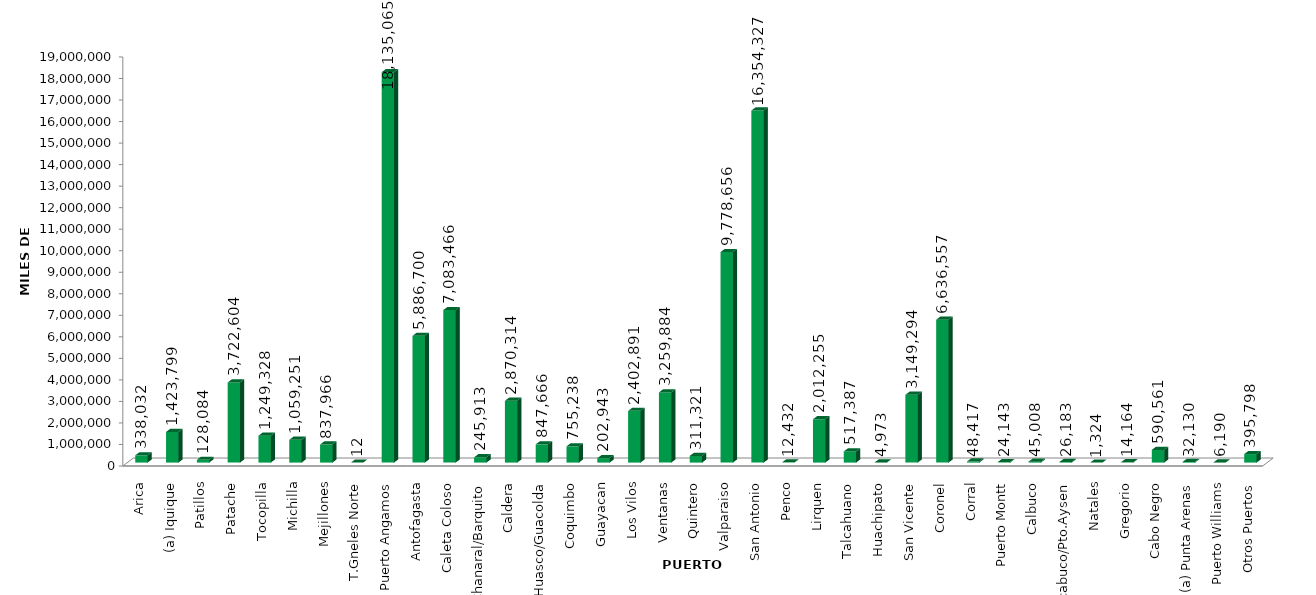
| Category | Series 0 |
|---|---|
| Arica | 338031.973 |
| (a) Iquique | 1423799.463 |
| Patillos | 128083.601 |
| Patache | 3722604.082 |
| Tocopilla | 1249327.694 |
| Michilla | 1059250.661 |
| Mejillones | 837966.006 |
| T.Gneles Norte | 12.35 |
| Puerto Angamos | 18135065.379 |
| Antofagasta | 5886700.035 |
| Caleta Coloso | 7083465.518 |
| Chanaral/Barquito | 245912.926 |
| Caldera | 2870314.417 |
| Huasco/Guacolda | 847666.437 |
| Coquimbo | 755237.847 |
| Guayacan | 202943.232 |
| Los Vilos | 2402890.921 |
| Ventanas | 3259884.392 |
| Quintero | 311321.257 |
| Valparaiso | 9778656.135 |
| San Antonio | 16354327.245 |
| Penco | 12431.512 |
| Lirquen | 2012254.734 |
| Talcahuano | 517386.731 |
| Huachipato | 4972.577 |
| San Vicente | 3149293.667 |
| Coronel | 6636556.851 |
| Corral | 48416.928 |
| Puerto Montt | 24143.439 |
| Calbuco | 45008.313 |
| Chacabuco/Pto.Aysen | 26183.152 |
| Natales | 1323.761 |
| Gregorio | 14164.317 |
| Cabo Negro | 590561.121 |
| (a) Punta Arenas | 32130.176 |
| Puerto Williams | 6190.496 |
| Otros Puertos | 395798.055 |